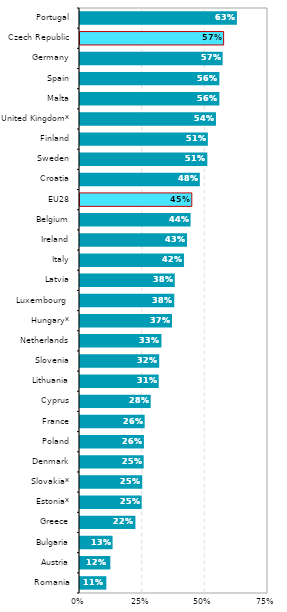
| Category | Series 0 |
|---|---|
| Romania | 0.105 |
| Austria | 0.121 |
| Bulgaria | 0.13 |
| Greece | 0.221 |
| Estonia* | 0.246 |
| Slovakia* | 0.248 |
| Denmark | 0.254 |
| Poland | 0.255 |
| France | 0.258 |
| Cyprus | 0.282 |
| Lithuania | 0.314 |
| Slovenia | 0.316 |
| Netherlands | 0.325 |
| Hungary* | 0.367 |
| Luxembourg  | 0.376 |
| Latvia | 0.378 |
| Italy | 0.415 |
| Ireland | 0.427 |
| Belgium | 0.441 |
| EU28 | 0.446 |
| Croatia | 0.478 |
| Sweden | 0.508 |
| Finland | 0.51 |
| United Kingdom* | 0.542 |
| Malta | 0.556 |
| Spain | 0.556 |
| Germany | 0.569 |
| Czech Republic | 0.573 |
| Portugal | 0.626 |